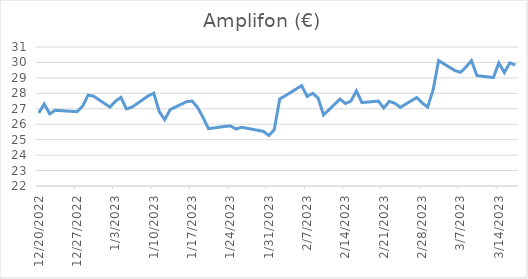
| Category | Series 0 |
|---|---|
| 12/20/22 | 26.73 |
| 12/21/22 | 27.31 |
| 12/22/22 | 26.67 |
| 12/23/22 | 26.9 |
| 12/27/22 | 26.81 |
| 12/28/22 | 27.16 |
| 12/29/22 | 27.88 |
| 12/30/22 | 27.82 |
| 1/2/23 | 27.11 |
| 1/3/23 | 27.49 |
| 1/4/23 | 27.74 |
| 1/5/23 | 26.99 |
| 1/6/23 | 27.1 |
| 1/9/23 | 27.84 |
| 1/10/23 | 28.01 |
| 1/11/23 | 26.82 |
| 1/12/23 | 26.29 |
| 1/13/23 | 26.95 |
| 1/16/23 | 27.46 |
| 1/17/23 | 27.5 |
| 1/18/23 | 27.09 |
| 1/19/23 | 26.43 |
| 1/20/23 | 25.71 |
| 1/23/23 | 25.86 |
| 1/24/23 | 25.89 |
| 1/25/23 | 25.69 |
| 1/26/23 | 25.8 |
| 1/27/23 | 25.74 |
| 1/30/23 | 25.54 |
| 1/31/23 | 25.27 |
| 2/1/23 | 25.64 |
| 2/2/23 | 27.64 |
| 2/3/23 | 27.84 |
| 2/6/23 | 28.5 |
| 2/7/23 | 27.8 |
| 2/8/23 | 28 |
| 2/9/23 | 27.7 |
| 2/10/23 | 26.6 |
| 2/13/23 | 27.63 |
| 2/14/23 | 27.34 |
| 2/15/23 | 27.5 |
| 2/16/23 | 28.16 |
| 2/17/23 | 27.4 |
| 2/20/23 | 27.5 |
| 2/21/23 | 27.05 |
| 2/22/23 | 27.48 |
| 2/23/23 | 27.36 |
| 2/24/23 | 27.09 |
| 2/27/23 | 27.73 |
| 2/28/23 | 27.38 |
| 3/1/23 | 27.11 |
| 3/2/23 | 28.22 |
| 3/3/23 | 30.12 |
| 3/6/23 | 29.47 |
| 3/7/23 | 29.36 |
| 3/8/23 | 29.7 |
| 3/9/23 | 30.12 |
| 3/10/23 | 29.15 |
| 3/13/23 | 29.02 |
| 3/14/23 | 29.97 |
| 3/15/23 | 29.35 |
| 3/16/23 | 29.97 |
| 3/17/23 | 29.83 |